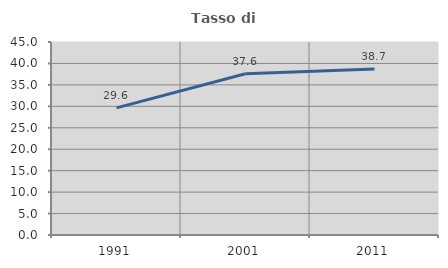
| Category | Tasso di occupazione   |
|---|---|
| 1991.0 | 29.636 |
| 2001.0 | 37.593 |
| 2011.0 | 38.685 |